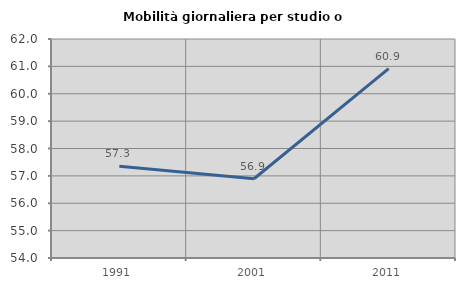
| Category | Mobilità giornaliera per studio o lavoro |
|---|---|
| 1991.0 | 57.348 |
| 2001.0 | 56.895 |
| 2011.0 | 60.917 |